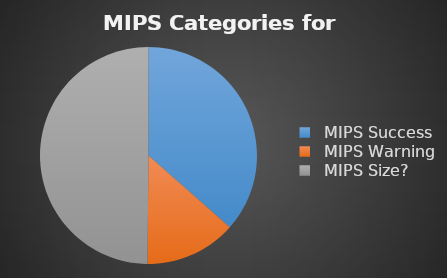
| Category | Series 0 |
|---|---|
|   MIPS Success | 252 |
|   MIPS Warning | 94 |
|   MIPS Size? | 344 |